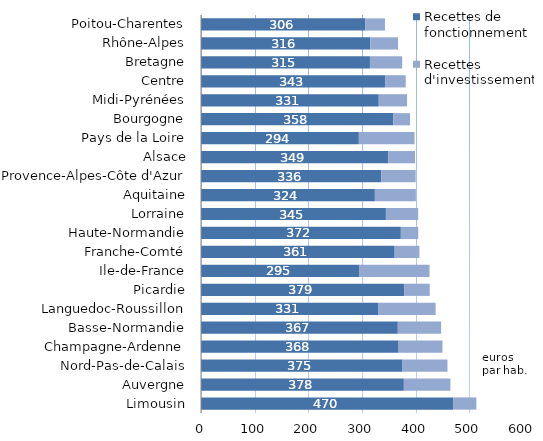
| Category | Recettes de fonctionnement | Recettes d'investissement |
|---|---|---|
| Limousin | 469.714 | 43.381 |
| Auvergne | 378.01 | 86.723 |
| Nord-Pas-de-Calais | 375.495 | 83.737 |
| Champagne-Ardenne | 368.273 | 81.674 |
| Basse-Normandie | 366.737 | 80.711 |
| Languedoc-Roussillon | 330.784 | 106.385 |
| Picardie | 378.602 | 47.622 |
| Ile-de-France | 295.479 | 130.321 |
| Franche-Comté | 360.895 | 46.059 |
| Haute-Normandie | 372.377 | 32.433 |
| Lorraine | 344.541 | 60.087 |
| Aquitaine | 323.989 | 76.385 |
| Provence-Alpes-Côte d'Azur | 335.812 | 64.226 |
| Alsace | 348.866 | 49.87 |
| Pays de la Loire | 294.129 | 103.755 |
| Bourgogne | 358.318 | 31.198 |
| Midi-Pyrénées | 331.224 | 52.79 |
| Centre | 343.101 | 38.356 |
| Bretagne | 314.805 | 60.061 |
| Rhône-Alpes | 315.539 | 51.558 |
| Poitou-Charentes | 305.835 | 36.919 |